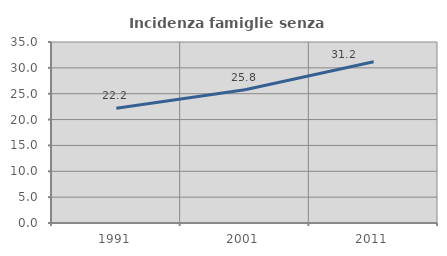
| Category | Incidenza famiglie senza nuclei |
|---|---|
| 1991.0 | 22.173 |
| 2001.0 | 25.754 |
| 2011.0 | 31.195 |